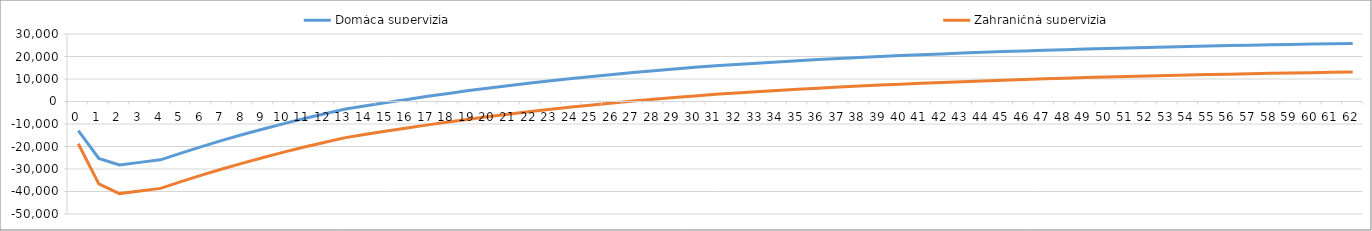
| Category | Domáca supervízia | Zahraničná supervízia |
|---|---|---|
| 0.0 | -12955.776 | -18776.333 |
| 1.0 | -25294.61 | -36658.556 |
| 2.0 | -28242.221 | -40930.42 |
| 3.0 | -27060.532 | -39748.732 |
| 4.0 | -25935.115 | -38623.314 |
| 5.0 | -22911.608 | -35599.807 |
| 6.0 | -20032.077 | -32720.276 |
| 7.0 | -17289.667 | -29977.866 |
| 8.0 | -14677.848 | -27366.047 |
| 9.0 | -12190.401 | -24878.6 |
| 10.0 | -9821.404 | -22509.603 |
| 11.0 | -7565.216 | -20253.416 |
| 12.0 | -5416.466 | -18104.666 |
| 13.0 | -3370.037 | -16058.237 |
| 14.0 | -1866.851 | -14555.05 |
| 15.0 | -435.244 | -13123.444 |
| 16.0 | 928.19 | -11760.009 |
| 17.0 | 2298.554 | -10389.646 |
| 18.0 | 3603.662 | -9084.538 |
| 19.0 | 4846.621 | -7841.578 |
| 20.0 | 6030.393 | -6657.807 |
| 21.0 | 7157.794 | -5530.405 |
| 22.0 | 8231.509 | -4456.69 |
| 23.0 | 9254.096 | -3434.104 |
| 24.0 | 10227.987 | -2460.212 |
| 25.0 | 11155.503 | -1532.696 |
| 26.0 | 12038.851 | -649.348 |
| 27.0 | 12880.136 | 191.936 |
| 28.0 | 13681.359 | 993.159 |
| 29.0 | 14444.428 | 1756.229 |
| 30.0 | 15171.161 | 2482.962 |
| 31.0 | 15863.288 | 3175.088 |
| 32.0 | 16470.1 | 3781.901 |
| 33.0 | 17048.017 | 4359.818 |
| 34.0 | 17598.414 | 4910.215 |
| 35.0 | 18122.602 | 5434.403 |
| 36.0 | 18621.828 | 5933.629 |
| 37.0 | 19097.282 | 6409.083 |
| 38.0 | 19550.095 | 6861.896 |
| 39.0 | 19981.346 | 7293.146 |
| 40.0 | 20392.06 | 7703.861 |
| 41.0 | 20783.217 | 8095.018 |
| 42.0 | 21155.748 | 8467.548 |
| 43.0 | 21510.538 | 8822.339 |
| 44.0 | 21848.434 | 9160.235 |
| 45.0 | 22170.24 | 9482.041 |
| 46.0 | 22476.722 | 9788.523 |
| 47.0 | 22768.609 | 10080.41 |
| 48.0 | 23046.597 | 10358.398 |
| 49.0 | 23311.348 | 10623.148 |
| 50.0 | 23563.491 | 10875.291 |
| 51.0 | 23803.627 | 11115.428 |
| 52.0 | 24032.329 | 11344.129 |
| 53.0 | 24250.139 | 11561.94 |
| 54.0 | 24457.578 | 11769.379 |
| 55.0 | 24655.139 | 11966.94 |
| 56.0 | 24843.292 | 12155.093 |
| 57.0 | 25022.486 | 12334.286 |
| 58.0 | 25193.146 | 12504.947 |
| 59.0 | 25355.68 | 12667.481 |
| 60.0 | 25510.474 | 12822.275 |
| 61.0 | 25657.897 | 12969.698 |
| 62.0 | 25798.3 | 13110.1 |